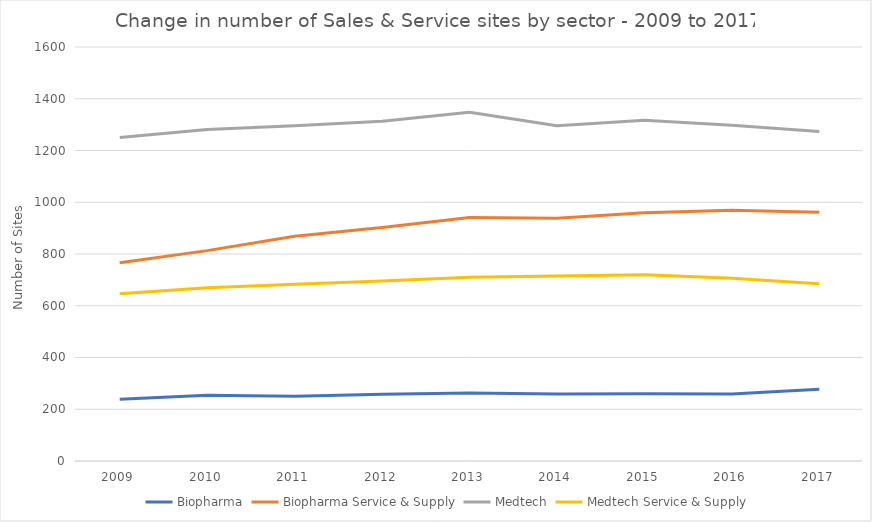
| Category | Biopharma | Biopharma Service & Supply | Medtech | Medtech Service & Supply |
|---|---|---|---|---|
| 2009 | 239 | 766 | 1250 | 646 |
| 2010 | 254 | 813 | 1281 | 670 |
| 2011 | 250 | 869 | 1296 | 683 |
| 2012 | 258 | 902 | 1313 | 696 |
| 2013 | 263 | 941 | 1348 | 710 |
| 2014 | 259 | 938 | 1296 | 715 |
| 2015 | 260 | 959 | 1317 | 720 |
| 2016 | 259 | 969 | 1298 | 706 |
| 2017 | 277 | 961 | 1273 | 685 |